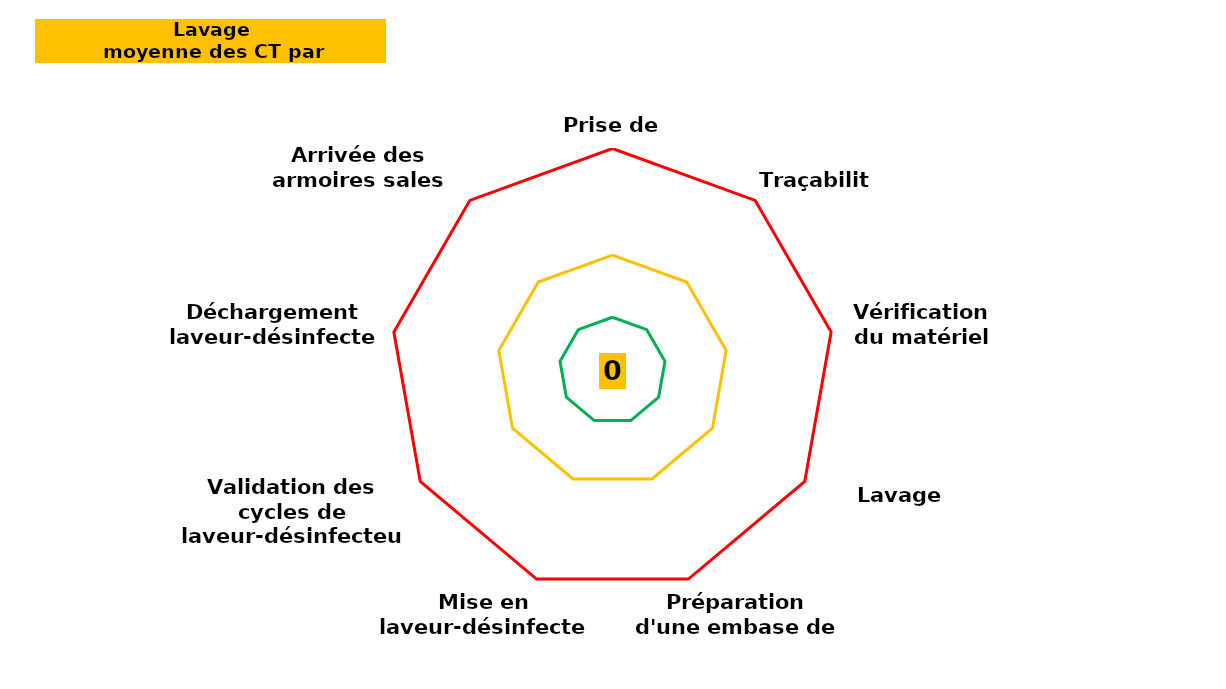
| Category | Series 1 | Series 0 | Series 2 | Series 3 |
|---|---|---|---|---|
| Prise de poste | 0 | 6 | 13 | 25 |
| Traçabilité | 0 | 6 | 13 | 25 |
| Vérification du matériel | 0 | 6 | 13 | 25 |
| Lavage manuel | 0 | 6 | 13 | 25 |
| Préparation d'une embase de lavage | 0 | 6 | 13 | 25 |
| Mise en laveur-désinfecteur | 0 | 6 | 13 | 25 |
| Validation des cycles de laveur-désinfecteur | 0 | 6 | 13 | 25 |
| Déchargement laveur-désinfecteur | 0 | 6 | 13 | 25 |
| Arrivée des armoires sales | 0 | 6 | 13 | 25 |